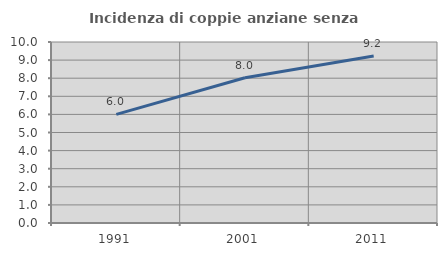
| Category | Incidenza di coppie anziane senza figli  |
|---|---|
| 1991.0 | 6.003 |
| 2001.0 | 8.027 |
| 2011.0 | 9.227 |